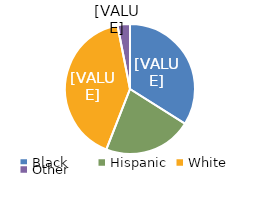
| Category | Series 0 |
|---|---|
| Black | 0.34 |
| Hispanic | 0.22 |
| White  | 0.41 |
| Other | 0.031 |